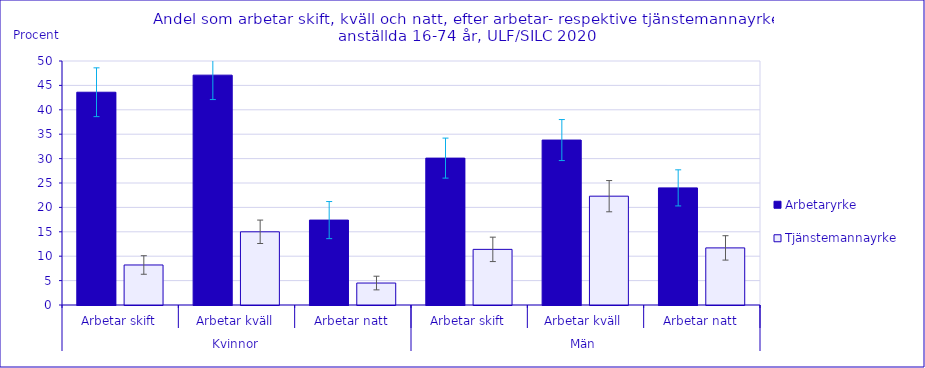
| Category | Arbetaryrke | Tjänstemannayrke |
|---|---|---|
| 0 | 43.6 | 8.2 |
| 1 | 47.1 | 15 |
| 2 | 17.4 | 4.5 |
| 3 | 30.1 | 11.4 |
| 4 | 33.8 | 22.3 |
| 5 | 24 | 11.7 |